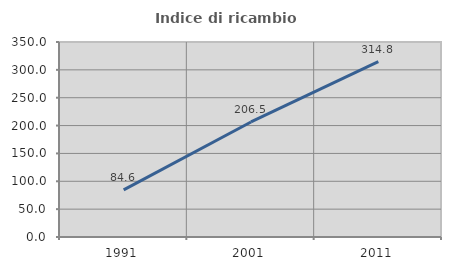
| Category | Indice di ricambio occupazionale  |
|---|---|
| 1991.0 | 84.615 |
| 2001.0 | 206.452 |
| 2011.0 | 314.815 |